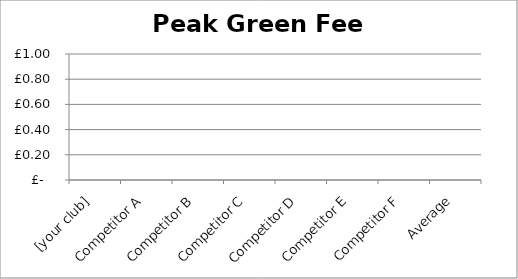
| Category | Peak-Rate Green Fee |
|---|---|
| [your club] | 0 |
| Competitor A | 0 |
| Competitor B | 0 |
| Competitor C | 0 |
| Competitor D | 0 |
| Competitor E | 0 |
| Competitor F | 0 |
| Average | 0 |